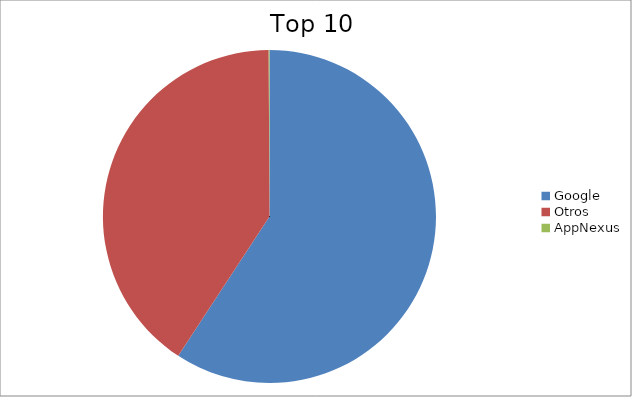
| Category | Series 0 |
|---|---|
| Google | 59.24 |
| Otros | 40.69 |
| AppNexus | 0.08 |